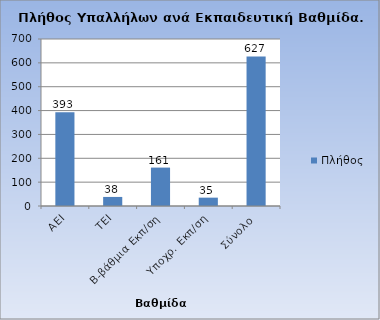
| Category | Πλήθος |
|---|---|
| ΑΕΙ | 393 |
| ΤΕΙ | 38 |
| Β-βάθμια Εκπ/ση | 161 |
| Υποχρ. Εκπ/ση | 35 |
| Σύνολο | 627 |